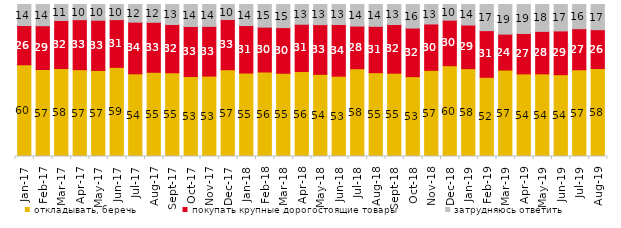
| Category | откладывать, беречь | покупать крупные дорогостоящие товары | затрудняюсь ответить |
|---|---|---|---|
| 2017-01-01 | 60.35 | 25.8 | 13.85 |
| 2017-02-01 | 56.8 | 28.6 | 13.85 |
| 2017-03-01 | 57.9 | 31.6 | 10.5 |
| 2017-04-01 | 57.1 | 32.85 | 10 |
| 2017-05-01 | 56.6 | 33.05 | 10.35 |
| 2017-06-01 | 58.65 | 31.4 | 9.95 |
| 2017-07-01 | 54.4 | 34 | 11.6 |
| 2017-08-01 | 55.4 | 32.9 | 11.7 |
| 2017-09-01 | 55.1 | 31.75 | 13.15 |
| 2017-10-01 | 52.6 | 32.95 | 14.45 |
| 2017-11-01 | 52.9 | 32.7 | 14.4 |
| 2017-12-01 | 57.1 | 33 | 9.9 |
| 2018-01-01 | 54.9 | 31.25 | 13.85 |
| 2018-02-01 | 55.6 | 29.5 | 14.9 |
| 2018-03-01 | 54.75 | 30.05 | 15.2 |
| 2018-04-01 | 55.9 | 31.1 | 13 |
| 2018-05-01 | 54.05 | 32.7 | 13.25 |
| 2018-06-01 | 52.85 | 34 | 13.15 |
| 2018-07-01 | 57.75 | 28.05 | 14.2 |
| 2018-08-01 | 55.15 | 30.5 | 14.35 |
| 2018-09-01 | 54.8 | 32.05 | 13.15 |
| 2018-10-01 | 52.55 | 31.95 | 15.5 |
| 2018-11-01 | 56.687 | 30.489 | 12.824 |
| 2018-12-01 | 59.75 | 29.95 | 10.3 |
| 2019-01-01 | 57.8 | 28.7 | 13.5 |
| 2019-02-01 | 52.1 | 30.7 | 17.2 |
| 2019-03-01 | 56.887 | 23.62 | 19.493 |
| 2019-04-01 | 54.356 | 26.584 | 19.059 |
| 2019-05-01 | 54.383 | 27.935 | 17.682 |
| 2019-06-01 | 53.815 | 28.778 | 17.406 |
| 2019-07-01 | 57.079 | 26.98 | 15.941 |
| 2019-08-01 | 57.892 | 25.524 | 16.583 |